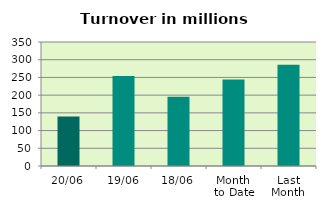
| Category | Series 0 |
|---|---|
| 20/06 | 140.019 |
| 19/06 | 253.723 |
| 18/06 | 195.362 |
| Month 
to Date | 244.286 |
| Last
Month | 285.992 |